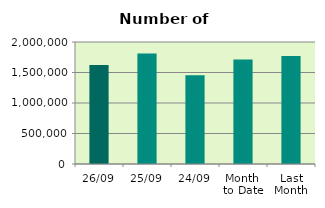
| Category | Series 0 |
|---|---|
| 26/09 | 1623056 |
| 25/09 | 1812688 |
| 24/09 | 1456254 |
| Month 
to Date | 1713619.053 |
| Last
Month | 1768562.909 |